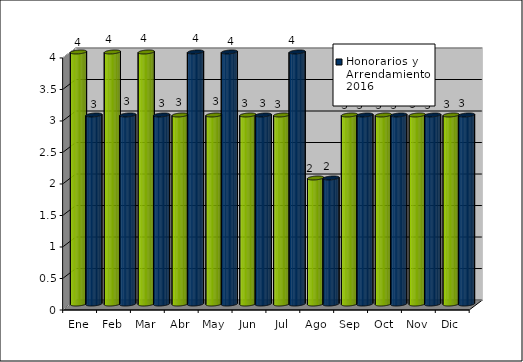
| Category | Honorarios y Arrendamiento 2015 | Honorarios y Arrendamiento 2016 |
|---|---|---|
| Ene | 4 | 3 |
| Feb | 4 | 3 |
| Mar | 4 | 3 |
| Abr | 3 | 4 |
| May | 3 | 4 |
| Jun | 3 | 3 |
| Jul | 3 | 4 |
| Ago | 2 | 2 |
| Sep | 3 | 3 |
| Oct | 3 | 3 |
| Nov | 3 | 3 |
| Dic | 3 | 3 |